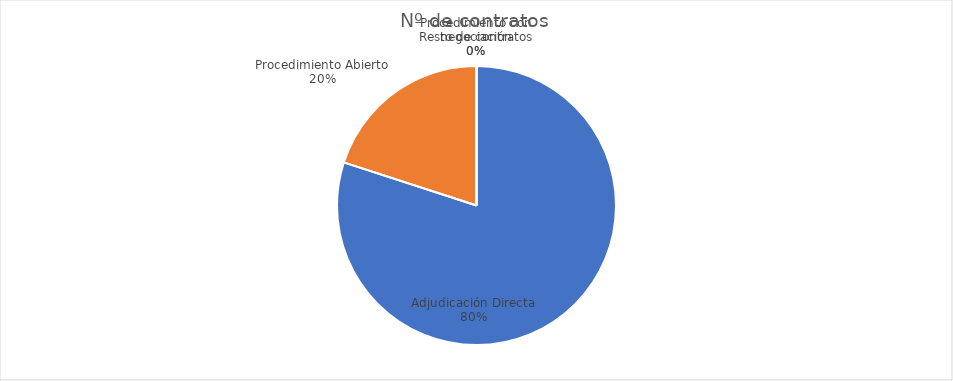
| Category | Nº de contratos |
|---|---|
| Adjudicación Directa | 4 |
| Procedimiento Abierto | 1 |
| Procedimiento con negociación | 0 |
| Resto de contratos | 0 |